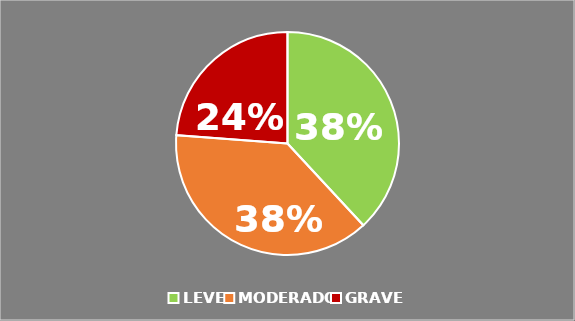
| Category | Series 0 |
|---|---|
| LEVE | 0.381 |
| MODERADO | 0.381 |
| GRAVE | 0.238 |